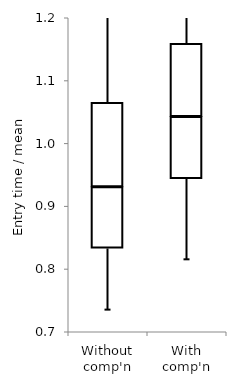
| Category | Upper quartile | Lower quartile | Median* |
|---|---|---|---|
| Without comp'n | 0.833 | 0.097 | 0.134 |
| With comp'n | 0.944 | 0.099 | 0.116 |